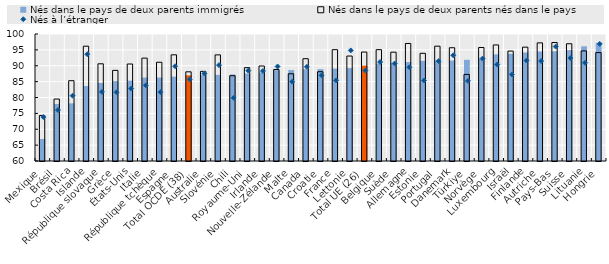
| Category | Nés dans le pays de deux parents immigrés | Nés dans le pays de deux parents nés dans le pays |
|---|---|---|
| Mexique | 66.946 | 74.357 |
| Brésil | 77.965 | 79.518 |
| Costa Rica | 78.154 | 85.29 |
| Islande | 83.604 | 96.16 |
| République slovaque | 84.583 | 90.615 |
| Grèce | 85.151 | 88.546 |
| États-Unis | 85.295 | 90.548 |
| Italie | 86.283 | 92.401 |
| République tchèque | 86.294 | 91.097 |
| Espagne | 86.576 | 93.444 |
| Total OCDE (38) | 86.977 | 88.088 |
| Australie | 87.129 | 88.229 |
| Slovénie | 87.131 | 93.43 |
| Chili | 87.232 | 86.865 |
| Royaume-Uni | 87.562 | 89.398 |
| Irlande | 87.872 | 89.92 |
| Nouvelle-Zélande | 88.608 | 88.827 |
| Malte | 88.642 | 87.477 |
| Canada | 88.898 | 92.223 |
| Croatie | 88.925 | 88.117 |
| France | 89.121 | 95.068 |
| Lettonie | 89.254 | 93.056 |
| Total UE (26) | 90.033 | 94.312 |
| Belgique | 90.669 | 95.067 |
| Suède | 90.902 | 94.275 |
| Allemagne | 91.142 | 97.021 |
| Estonie | 91.541 | 93.92 |
| Portugal | 91.646 | 96.165 |
| Danemark | 91.649 | 95.671 |
| Türkiye | 91.873 | 87.266 |
| Norvège | 92.276 | 95.747 |
| Luxembourg | 93.572 | 96.552 |
| Israël | 93.766 | 94.624 |
| Finlande | 94.173 | 95.861 |
| Autriche | 94.499 | 97.2 |
| Pays-Bas | 94.572 | 97.314 |
| Suisse | 94.943 | 96.928 |
| Lituanie | 96.129 | 94.678 |
| Hongrie | 97.221 | 94.144 |